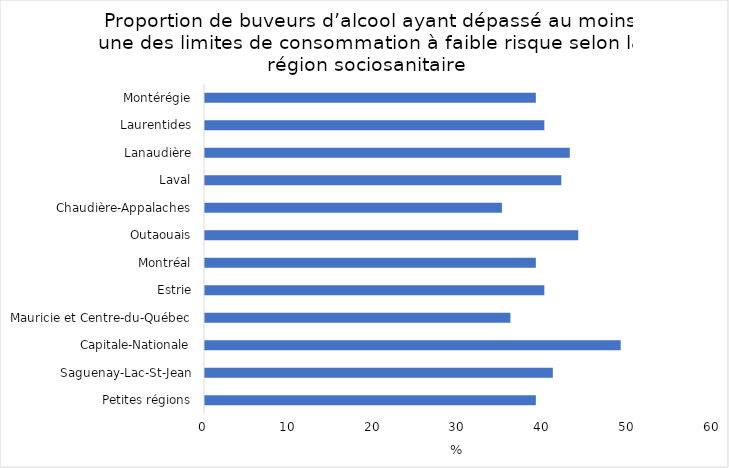
| Category | Series 0 |
|---|---|
| Petites régions | 39 |
| Saguenay-Lac-St-Jean | 41 |
| Capitale-Nationale | 49 |
| Mauricie et Centre-du-Québec | 36 |
| Estrie | 40 |
| Montréal | 39 |
| Outaouais | 44 |
| Chaudière-Appalaches | 35 |
| Laval | 42 |
| Lanaudière | 43 |
| Laurentides | 40 |
| Montérégie | 39 |